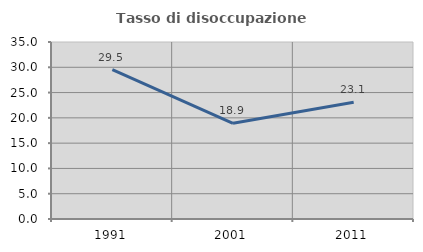
| Category | Tasso di disoccupazione giovanile  |
|---|---|
| 1991.0 | 29.545 |
| 2001.0 | 18.919 |
| 2011.0 | 23.077 |